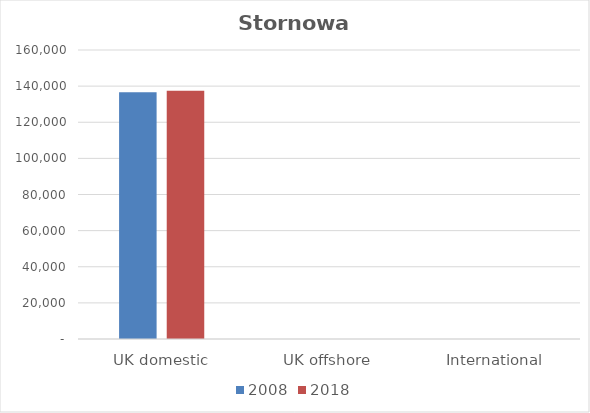
| Category | 2008 | 2018 |
|---|---|---|
| UK domestic | 136670 | 137443 |
| UK offshore | 0 | 0 |
| International | 0 | 0 |